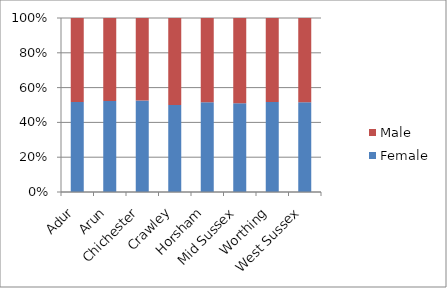
| Category | Female | Male |
|---|---|---|
| Adur | 19764 | 18413 |
| Arun | 49670 | 45340 |
| Chichester | 39845 | 35903 |
| Crawley | 33774 | 33798 |
| Horsham | 45333 | 42673 |
| Mid Sussex | 47577 | 45829 |
| Worthing | 34082 | 31789 |
| West Sussex | 270045 | 253745 |